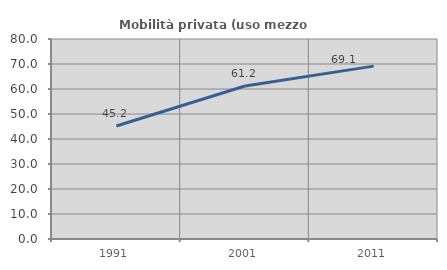
| Category | Mobilità privata (uso mezzo privato) |
|---|---|
| 1991.0 | 45.215 |
| 2001.0 | 61.213 |
| 2011.0 | 69.146 |